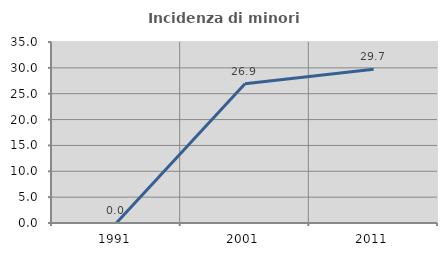
| Category | Incidenza di minori stranieri |
|---|---|
| 1991.0 | 0 |
| 2001.0 | 26.923 |
| 2011.0 | 29.73 |